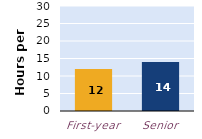
| Category | hours per week |
|---|---|
| First-year | 12 |
| Senior | 14 |